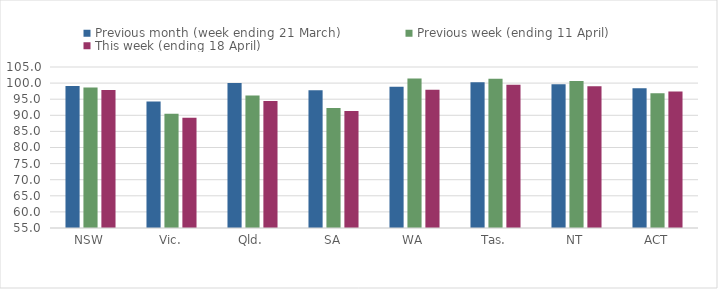
| Category | Previous month (week ending 21 March) | Previous week (ending 11 April) | This week (ending 18 April) |
|---|---|---|---|
| NSW | 99.099 | 98.617 | 97.848 |
| Vic. | 94.282 | 90.498 | 89.205 |
| Qld. | 100 | 96.173 | 94.426 |
| SA | 97.746 | 92.284 | 91.368 |
| WA | 98.902 | 101.442 | 97.962 |
| Tas. | 100.245 | 101.361 | 99.486 |
| NT | 99.675 | 100.689 | 99.028 |
| ACT | 98.412 | 96.872 | 97.356 |